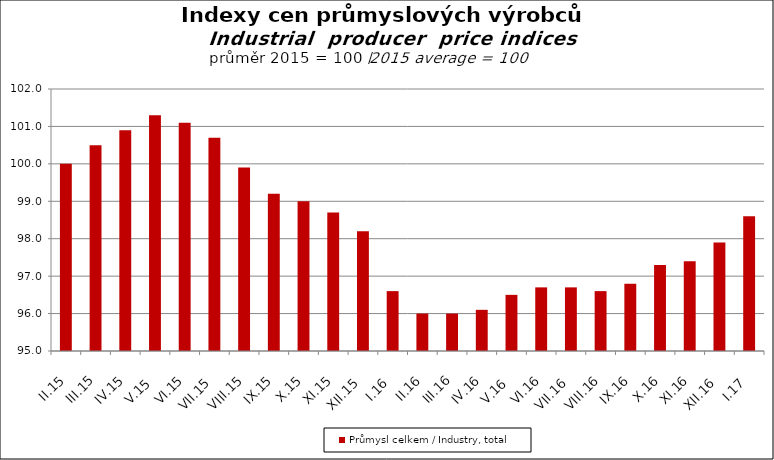
| Category | Průmysl celkem / Industry, total |
|---|---|
| II.15 | 100 |
| III.15 | 100.5 |
| IV.15 | 100.9 |
| V.15 | 101.3 |
| VI.15 | 101.1 |
| VII.15 | 100.7 |
| VIII.15 | 99.9 |
| IX.15 | 99.2 |
| X.15 | 99 |
| XI.15 | 98.7 |
| XII.15 | 98.2 |
| I.16 | 96.6 |
| II.16 | 96 |
| III.16 | 96 |
| IV.16 | 96.1 |
| V.16 | 96.5 |
| VI.16 | 96.7 |
| VII.16 | 96.7 |
| VIII.16 | 96.6 |
| IX.16 | 96.8 |
| X.16 | 97.3 |
| XI.16 | 97.4 |
| XII.16 | 97.9 |
| I.17 | 98.6 |